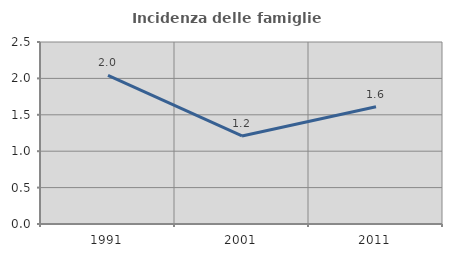
| Category | Incidenza delle famiglie numerose |
|---|---|
| 1991.0 | 2.042 |
| 2001.0 | 1.209 |
| 2011.0 | 1.612 |